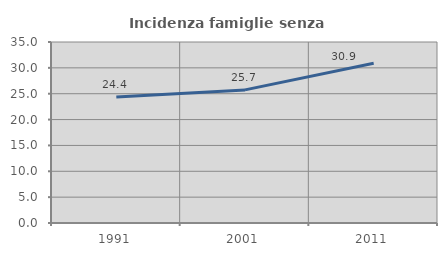
| Category | Incidenza famiglie senza nuclei |
|---|---|
| 1991.0 | 24.381 |
| 2001.0 | 25.74 |
| 2011.0 | 30.892 |